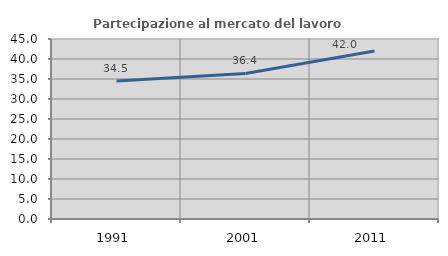
| Category | Partecipazione al mercato del lavoro  femminile |
|---|---|
| 1991.0 | 34.494 |
| 2001.0 | 36.391 |
| 2011.0 | 41.983 |